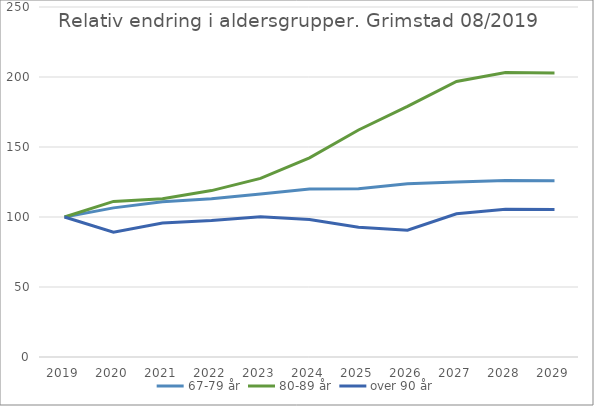
| Category | 67-79 år | 80-89 år | over 90 år |
|---|---|---|---|
| 2019 | 100 | 100 | 100 |
| 2020 | 106.527 | 111.123 | 89.182 |
| 2021 | 110.967 | 113.058 | 95.65 |
| 2022 | 113.031 | 118.871 | 97.467 |
| 2023 | 116.395 | 127.587 | 100.163 |
| 2024 | 120.083 | 142.294 | 98.154 |
| 2025 | 120.264 | 162.161 | 92.647 |
| 2026 | 123.721 | 178.993 | 90.548 |
| 2027 | 125.034 | 196.813 | 102.319 |
| 2028 | 126.017 | 203.135 | 105.521 |
| 2029 | 125.925 | 202.866 | 105.385 |